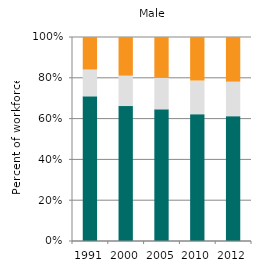
| Category | Agriculture | Industry | Services |
|---|---|---|---|
| 1991.0 | 70.913 | 13.131 | 15.955 |
| 2000.0 | 66.146 | 14.895 | 18.959 |
| 2005.0 | 64.546 | 15.442 | 20.011 |
| 2010.0 | 62.158 | 16.493 | 21.349 |
| 2012.0 | 61.199 | 16.899 | 21.902 |